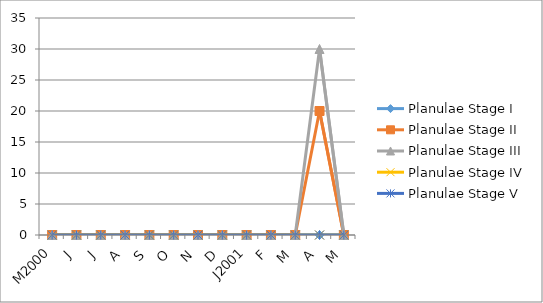
| Category | Planulae |
|---|---|
| M2000 | 0 |
| J | 0 |
| J | 0 |
| A | 0 |
| S | 0 |
| O | 0 |
| N | 0 |
| D | 0 |
| J2001 | 0 |
| F | 0 |
| M | 0 |
| A | 0 |
| M | 0 |